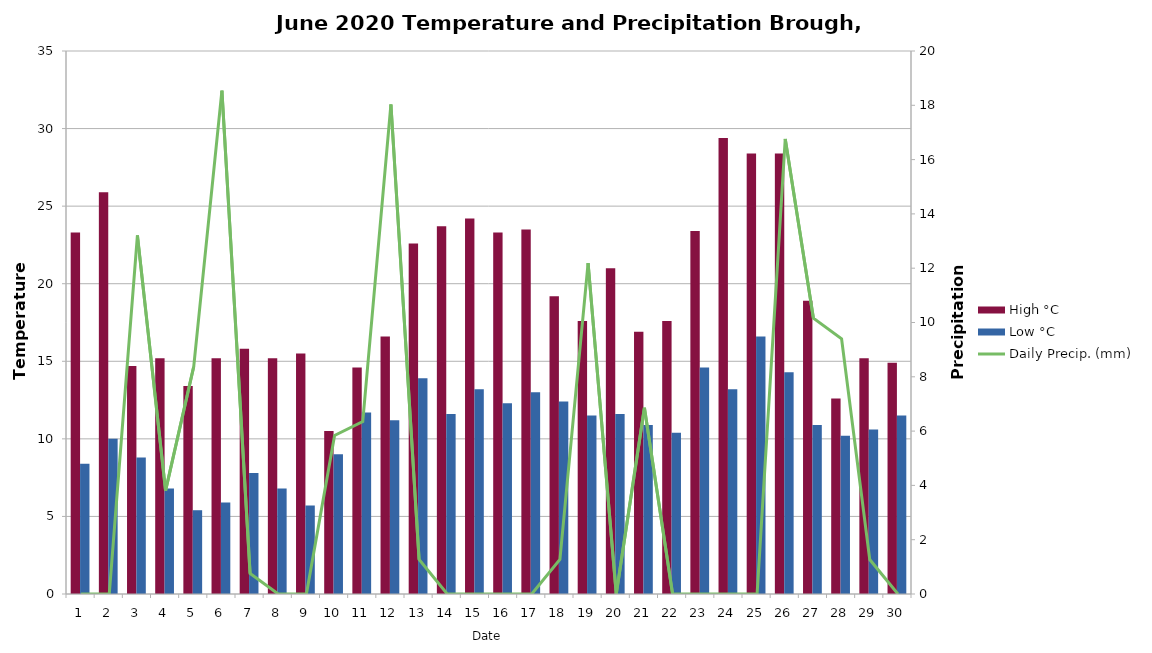
| Category | High °C | Low °C |
|---|---|---|
| 0 | 23.3 | 8.4 |
| 1 | 25.9 | 10 |
| 2 | 14.7 | 8.8 |
| 3 | 15.2 | 6.8 |
| 4 | 13.4 | 5.4 |
| 5 | 15.2 | 5.9 |
| 6 | 15.8 | 7.8 |
| 7 | 15.2 | 6.8 |
| 8 | 15.5 | 5.7 |
| 9 | 10.5 | 9 |
| 10 | 14.6 | 11.7 |
| 11 | 16.6 | 11.2 |
| 12 | 22.6 | 13.9 |
| 13 | 23.7 | 11.6 |
| 14 | 24.2 | 13.2 |
| 15 | 23.3 | 12.3 |
| 16 | 23.5 | 13 |
| 17 | 19.2 | 12.4 |
| 18 | 17.6 | 11.5 |
| 19 | 21 | 11.6 |
| 20 | 16.9 | 10.9 |
| 21 | 17.6 | 10.4 |
| 22 | 23.4 | 14.6 |
| 23 | 29.4 | 13.2 |
| 24 | 28.4 | 16.6 |
| 25 | 28.4 | 14.3 |
| 26 | 18.9 | 10.9 |
| 27 | 12.6 | 10.2 |
| 28 | 15.2 | 10.6 |
| 29 | 14.9 | 11.5 |